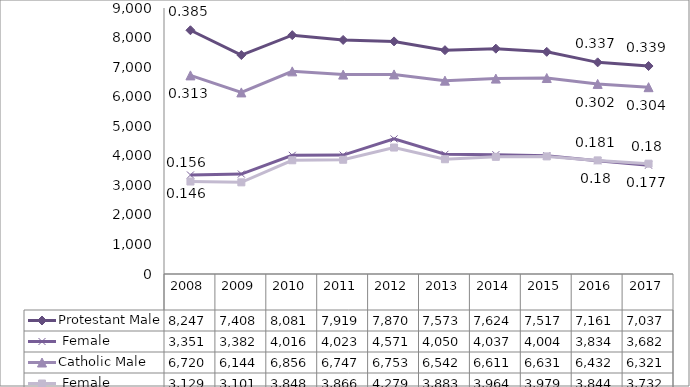
| Category | Protestant | Catholic |
|---|---|---|
| 2008.0 | 3351 | 3129 |
| 2009.0 | 3382 | 3101 |
| 2010.0 | 4016 | 3848 |
| 2011.0 | 4023 | 3866 |
| 2012.0 | 4571 | 4279 |
| 2013.0 | 4050 | 3883 |
| 2014.0 | 4037 | 3964 |
| 2015.0 | 4004 | 3979 |
| 2016.0 | 3834 | 3844 |
| 2017.0 | 3682 | 3732 |